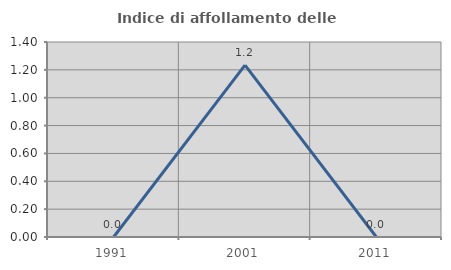
| Category | Indice di affollamento delle abitazioni  |
|---|---|
| 1991.0 | 0 |
| 2001.0 | 1.235 |
| 2011.0 | 0 |